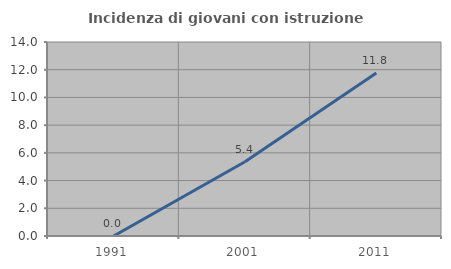
| Category | Incidenza di giovani con istruzione universitaria |
|---|---|
| 1991.0 | 0 |
| 2001.0 | 5.357 |
| 2011.0 | 11.765 |